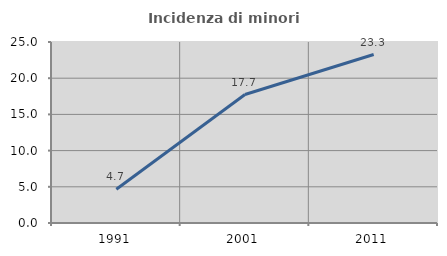
| Category | Incidenza di minori stranieri |
|---|---|
| 1991.0 | 4.651 |
| 2001.0 | 17.742 |
| 2011.0 | 23.27 |